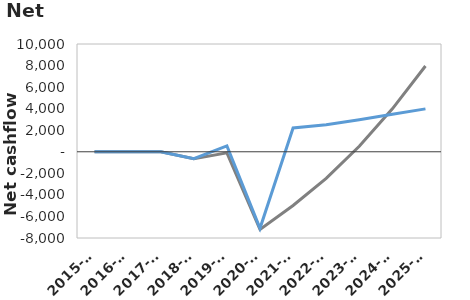
| Category | Series 2 | Series 0 |
|---|---|---|
| 2015-16 | 0 | 0 |
| 2016-17 | 0 | 0 |
| 2017-18 | 0 | 0 |
| 2018-19 | -649 | -649 |
| 2019-20 | -103 | 546 |
| 2020-21 | -7200 | -7097 |
| 2021-22 | -4987 | 2213 |
| 2022-23 | -2469 | 2518 |
| 2023-24 | 506 | 2975 |
| 2024-25 | 3983 | 3477 |
| 2025-26 | 7962 | 3979 |